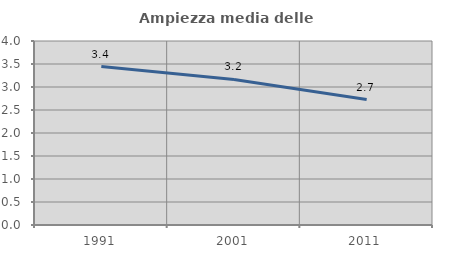
| Category | Ampiezza media delle famiglie |
|---|---|
| 1991.0 | 3.445 |
| 2001.0 | 3.164 |
| 2011.0 | 2.727 |